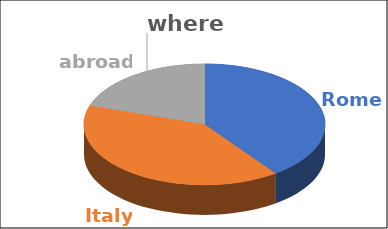
| Category | where | Series 1 | Series 2 | Series 3 | Series 4 |
|---|---|---|---|---|---|
| Rome | 0.4 |  |  |  |  |
| Italy | 0.4 |  |  |  |  |
| abroad | 0.2 |  |  |  |  |